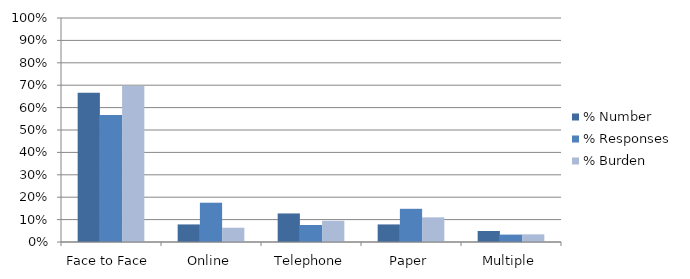
| Category | % Number | % Responses | % Burden |
|---|---|---|---|
| Face to Face | 0.667 | 0.567 | 0.698 |
| Online | 0.078 | 0.175 | 0.064 |
| Telephone | 0.127 | 0.076 | 0.095 |
| Paper | 0.078 | 0.148 | 0.11 |
| Multiple | 0.049 | 0.033 | 0.034 |